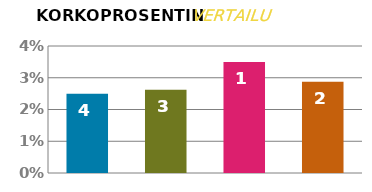
| Category | KORKO |
|---|---|
| 0 | 0.025 |
| 1 | 0.026 |
| 2 | 0.035 |
| 3 | 0.029 |